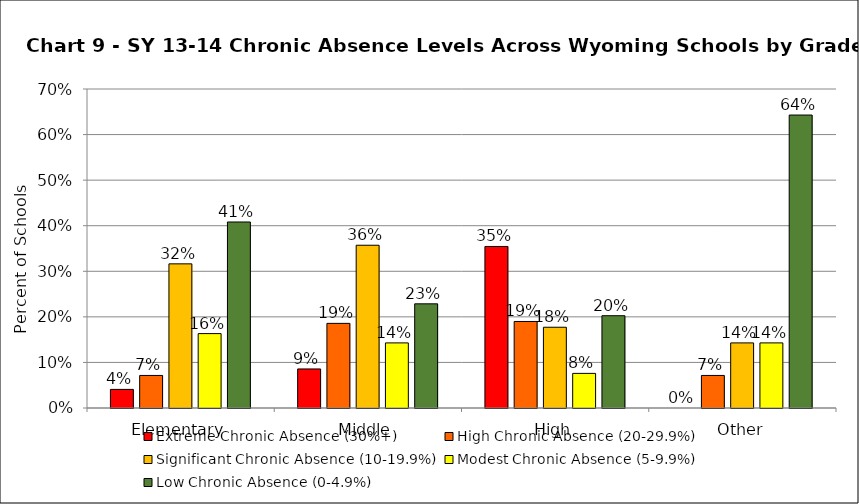
| Category | Extreme Chronic Absence (30%+) | High Chronic Absence (20-29.9%) | Significant Chronic Absence (10-19.9%) | Modest Chronic Absence (5-9.9%) | Low Chronic Absence (0-4.9%) |
|---|---|---|---|---|---|
| 0 | 0.041 | 0.071 | 0.316 | 0.163 | 0.408 |
| 1 | 0.086 | 0.186 | 0.357 | 0.143 | 0.229 |
| 2 | 0.354 | 0.19 | 0.177 | 0.076 | 0.203 |
| 3 | 0 | 0.071 | 0.143 | 0.143 | 0.643 |